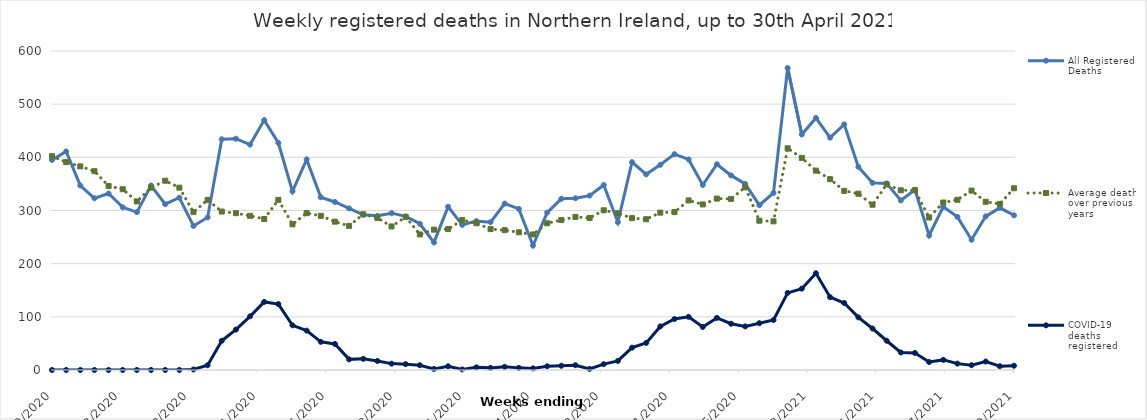
| Category | All Registered Deaths | Average deaths over previous 5 years | COVID-19 deaths registered |
|---|---|---|---|
| 1/10/20 | 395 | 402.2 | 0 |
| 1/17/20 | 411 | 391 | 0 |
| 1/24/20 | 347 | 383 | 0 |
| 1/31/20 | 323 | 374 | 0 |
| 2/7/20 | 332 | 346 | 0 |
| 2/14/20 | 306 | 340 | 0 |
| 2/21/20 | 297 | 317 | 0 |
| 2/28/20 | 347 | 343 | 0 |
| 3/6/20 | 312 | 356 | 0 |
| 3/13/20 | 324 | 343 | 0 |
| 3/20/20 | 271 | 297 | 1 |
| 3/27/20 | 287 | 320 | 9 |
| 4/3/20 | 434 | 298 | 55 |
| 4/10/20 | 435 | 295 | 76 |
| 4/17/20 | 424 | 290 | 101 |
| 4/24/20 | 470 | 284 | 128 |
| 5/1/20 | 427 | 320 | 124 |
| 5/8/20 | 336 | 274 | 84 |
| 5/15/20 | 396 | 295 | 74 |
| 5/22/20 | 325 | 290 | 53 |
| 5/29/20 | 316 | 279 | 49 |
| 6/5/20 | 304 | 271 | 20 |
| 6/12/20 | 292 | 293 | 21 |
| 6/19/20 | 290 | 286 | 17 |
| 6/26/20 | 295 | 270 | 12 |
| 7/3/20 | 289 | 288 | 11 |
| 7/10/20 | 275 | 255 | 9 |
| 7/17/20 | 240 | 264 | 2 |
| 7/24/20 | 307 | 265 | 7 |
| 7/31/20 | 273 | 282 | 1 |
| 8/7/20 | 280 | 276 | 5 |
| 8/14/20 | 278 | 265 | 4 |
| 8/21/20 | 313 | 263 | 6 |
| 8/28/20 | 303 | 259 | 4 |
| 9/4/20 | 234 | 255 | 3 |
| 9/11/20 | 296 | 276 | 7 |
| 9/18/20 | 322 | 282 | 8 |
| 9/25/20 | 323 | 288 | 9 |
| 10/2/20 | 328 | 286 | 2 |
| 10/9/20 | 348 | 300.4 | 11 |
| 10/16/20 | 278 | 294.8 | 17 |
| 10/23/20 | 391 | 285.6 | 42 |
| 10/30/20 | 368 | 283.6 | 51 |
| 11/6/20 | 386 | 296 | 82 |
| 11/13/20 | 406 | 297 | 96 |
| 11/20/20 | 396 | 319 | 100 |
| 11/27/20 | 348 | 311.4 | 81 |
| 12/4/20 | 387 | 322.4 | 98 |
| 12/11/20 | 366 | 321.8 | 87 |
| 12/18/20 | 350 | 343.8 | 82 |
| 12/25/20 | 310 | 280.8 | 88 |
| 1/1/21 | 333 | 279.6 | 94 |
| 1/8/21 | 568 | 417 | 145 |
| 1/15/21 | 443 | 399 | 153 |
| 1/22/21 | 474 | 375 | 182 |
| 1/29/21 | 437 | 359 | 137 |
| 2/5/21 | 462 | 337 | 126 |
| 2/12/21 | 382 | 331.6 | 99 |
| 2/19/21 | 352 | 310.8 | 78 |
| 2/26/21 | 351 | 349 | 55 |
| 3/5/21 | 319 | 338 | 33 |
| 3/12/21 | 339 | 338 | 32 |
| 3/19/21 | 253 | 286.8 | 15 |
| 3/26/21 | 307 | 315 | 19 |
| 4/2/21 | 288 | 320.2 | 12 |
| 4/9/21 | 245 | 337.4 | 9 |
| 4/16/21 | 289 | 316.4 | 16 |
| 4/23/21 | 305 | 312.4 | 7 |
| 4/30/21 | 291 | 341.8 | 8 |